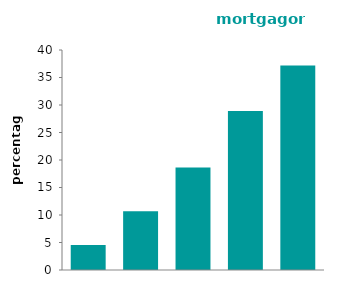
| Category | mortgagors |
|---|---|
| quintile 1 (lowest) | 4.559 |
| quintile 2 | 10.686 |
| quintile 3 | 18.648 |
| quintile 4 | 28.909 |
| quintile 5 (highest) | 37.199 |